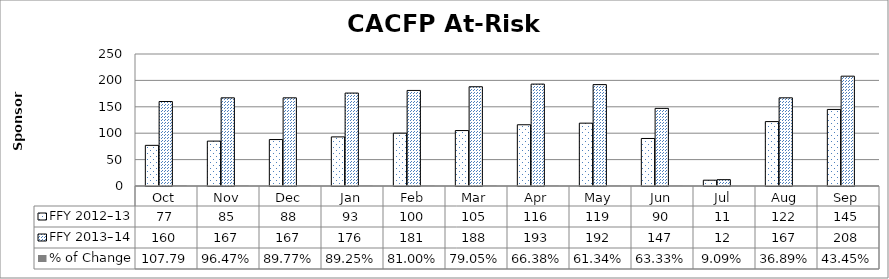
| Category | FFY 2012–13 | FFY 2013–14 | % of Change |
|---|---|---|---|
| Oct | 77 | 160 | 1.078 |
| Nov | 85 | 167 | 0.965 |
| Dec | 88 | 167 | 0.898 |
| Jan | 93 | 176 | 0.892 |
| Feb | 100 | 181 | 0.81 |
| Mar | 105 | 188 | 0.79 |
| Apr | 116 | 193 | 0.664 |
| May | 119 | 192 | 0.613 |
| Jun | 90 | 147 | 0.633 |
| Jul | 11 | 12 | 0.091 |
| Aug | 122 | 167 | 0.369 |
| Sep | 145 | 208 | 0.434 |